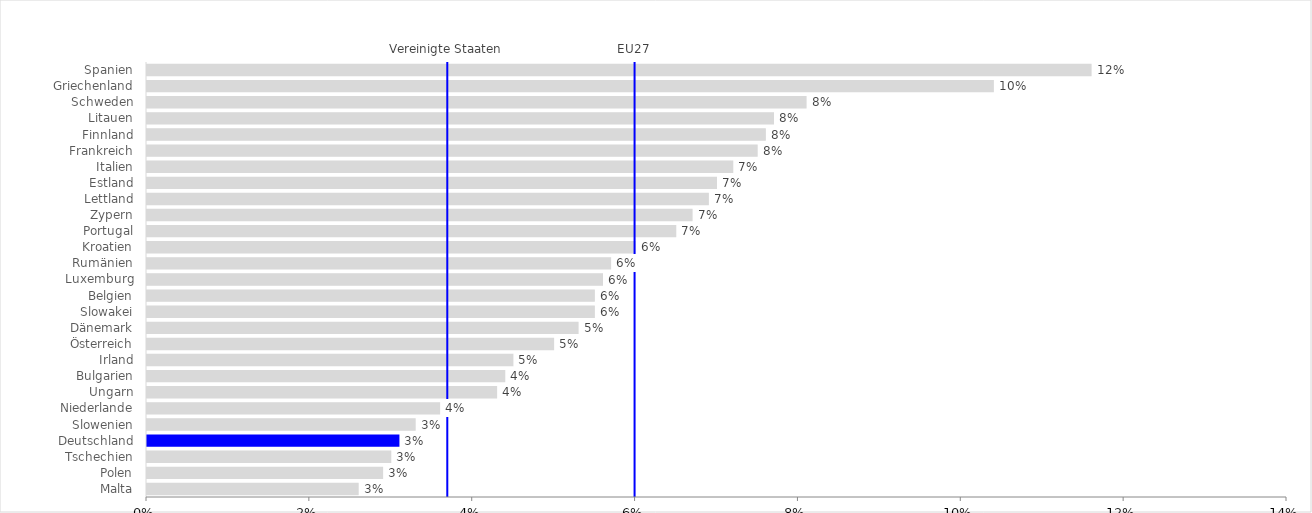
| Category | 3% |
|---|---|
| Malta | 2.6 |
| Polen | 2.9 |
| Tschechien | 3 |
| Deutschland | 3.1 |
| Slowenien | 3.3 |
| Niederlande | 3.6 |
| Ungarn | 4.3 |
| Bulgarien | 4.4 |
| Irland | 4.5 |
| Österreich | 5 |
| Dänemark | 5.3 |
| Slowakei | 5.5 |
| Belgien | 5.5 |
| Luxemburg | 5.6 |
| Rumänien | 5.7 |
| Kroatien | 6 |
| Portugal | 6.5 |
| Zypern | 6.7 |
| Lettland | 6.9 |
| Estland | 7 |
| Italien | 7.2 |
| Frankreich | 7.5 |
| Finnland | 7.6 |
| Litauen | 7.7 |
| Schweden | 8.1 |
| Griechenland | 10.4 |
| Spanien | 11.6 |